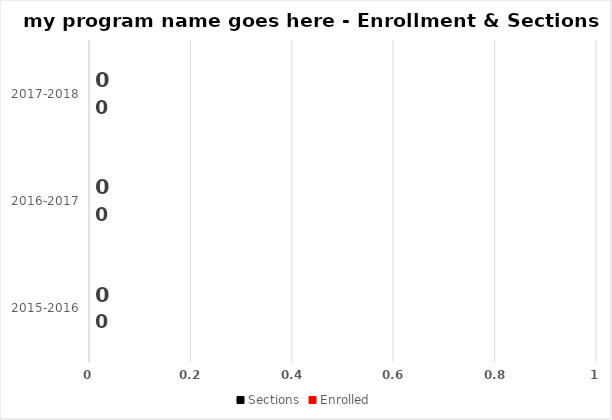
| Category | Sections | Enrolled |
|---|---|---|
| 2015-2016 | 0 | 0 |
| 2016-2017 | 0 | 0 |
| 2017-2018 | 0 | 0 |